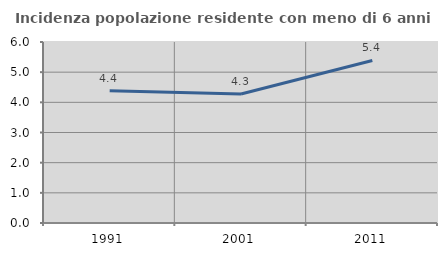
| Category | Incidenza popolazione residente con meno di 6 anni |
|---|---|
| 1991.0 | 4.387 |
| 2001.0 | 4.275 |
| 2011.0 | 5.387 |